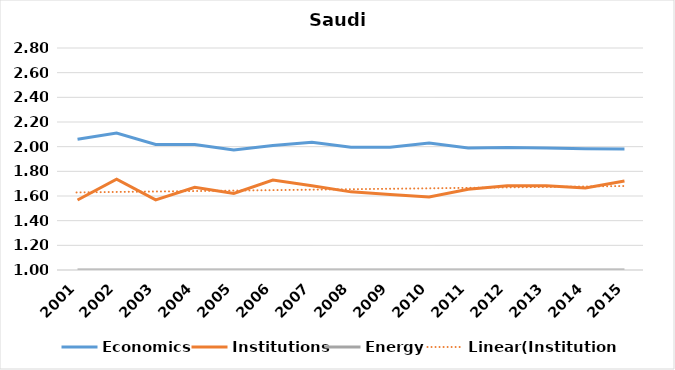
| Category | Economics | Institutions | Energy |
|---|---|---|---|
| 2001.0 | 2.06 | 1.567 | 1 |
| 2002.0 | 2.11 | 1.736 | 1 |
| 2003.0 | 2.017 | 1.569 | 1 |
| 2004.0 | 2.018 | 1.67 | 1 |
| 2005.0 | 1.973 | 1.621 | 1 |
| 2006.0 | 2.009 | 1.73 | 1 |
| 2007.0 | 2.036 | 1.684 | 1 |
| 2008.0 | 1.995 | 1.634 | 1 |
| 2009.0 | 1.995 | 1.613 | 1 |
| 2010.0 | 2.029 | 1.592 | 1 |
| 2011.0 | 1.989 | 1.655 | 1 |
| 2012.0 | 1.994 | 1.683 | 1 |
| 2013.0 | 1.99 | 1.684 | 1 |
| 2014.0 | 1.983 | 1.665 | 1 |
| 2015.0 | 1.981 | 1.721 | 1 |